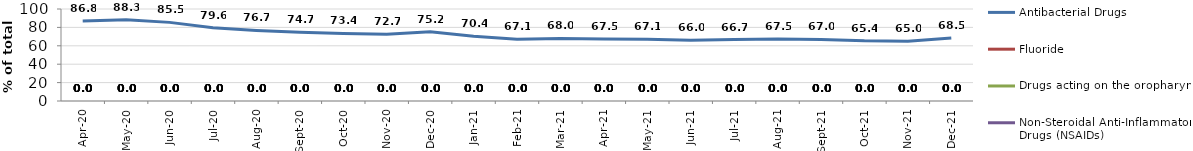
| Category | Antibacterial Drugs | Fluoride | Drugs acting on the oropharynx | Non-Steroidal Anti-Inflammatory Drugs (NSAIDs) | Analgesics | Other |
|---|---|---|---|---|---|---|
| 2020-04-01 | 86.846 |  |  |  |  |  |
| 2020-05-01 | 88.272 |  |  |  |  |  |
| 2020-06-01 | 85.468 |  |  |  |  |  |
| 2020-07-01 | 79.573 |  |  |  |  |  |
| 2020-08-01 | 76.668 |  |  |  |  |  |
| 2020-09-01 | 74.697 |  |  |  |  |  |
| 2020-10-01 | 73.415 |  |  |  |  |  |
| 2020-11-01 | 72.658 |  |  |  |  |  |
| 2020-12-01 | 75.234 |  |  |  |  |  |
| 2021-01-01 | 70.417 |  |  |  |  |  |
| 2021-02-01 | 67.093 |  |  |  |  |  |
| 2021-03-01 | 68.019 |  |  |  |  |  |
| 2021-04-01 | 67.506 |  |  |  |  |  |
| 2021-05-01 | 67.12 |  |  |  |  |  |
| 2021-06-01 | 66.014 |  |  |  |  |  |
| 2021-07-01 | 66.736 |  |  |  |  |  |
| 2021-08-01 | 67.514 |  |  |  |  |  |
| 2021-09-01 | 66.975 |  |  |  |  |  |
| 2021-10-01 | 65.405 |  |  |  |  |  |
| 2021-11-01 | 65.021 |  |  |  |  |  |
| 2021-12-01 | 68.469 |  |  |  |  |  |